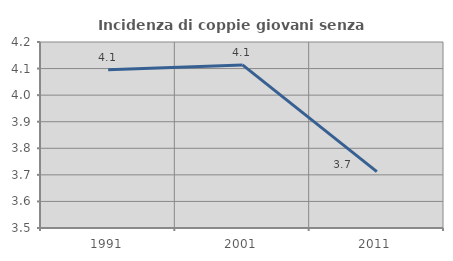
| Category | Incidenza di coppie giovani senza figli |
|---|---|
| 1991.0 | 4.096 |
| 2001.0 | 4.114 |
| 2011.0 | 3.712 |